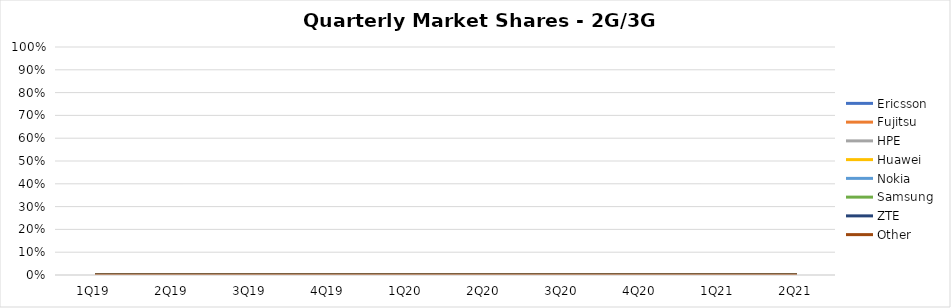
| Category | Ericsson | Fujitsu | HPE | Huawei | Nokia | Samsung | ZTE | Other |
|---|---|---|---|---|---|---|---|---|
| 1Q19 | 0 | 0 | 0 | 0 | 0 | 0 | 0 | 0 |
| 2Q19 | 0 | 0 | 0 | 0 | 0 | 0 | 0 | 0 |
| 3Q19 | 0 | 0 | 0 | 0 | 0 | 0 | 0 | 0 |
| 4Q19 | 0 | 0 | 0 | 0 | 0 | 0 | 0 | 0 |
| 1Q20 | 0 | 0 | 0 | 0 | 0 | 0 | 0 | 0 |
| 2Q20 | 0 | 0 | 0 | 0 | 0 | 0 | 0 | 0 |
| 3Q20 | 0 | 0 | 0 | 0 | 0 | 0 | 0 | 0 |
| 4Q20 | 0 | 0 | 0 | 0 | 0 | 0 | 0 | 0 |
| 1Q21 | 0 | 0 | 0 | 0 | 0 | 0 | 0 | 0 |
| 2Q21 | 0 | 0 | 0 | 0 | 0 | 0 | 0 | 0 |